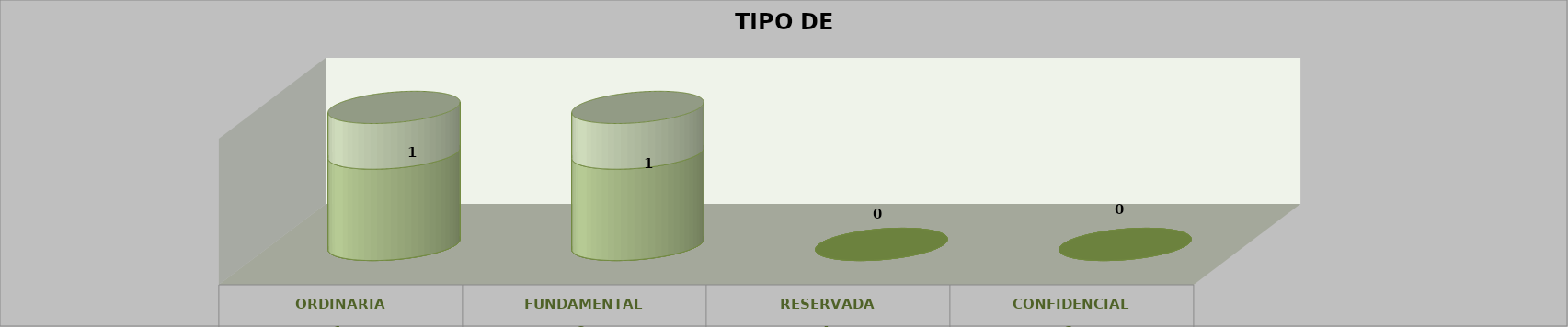
| Category | Series 0 | Series 2 | Series 1 | Series 3 | Series 4 |
|---|---|---|---|---|---|
| 0 |  |  |  | 1 | 0.5 |
| 1 |  |  |  | 1 | 0.5 |
| 2 |  |  |  | 0 | 0 |
| 3 |  |  |  | 0 | 0 |